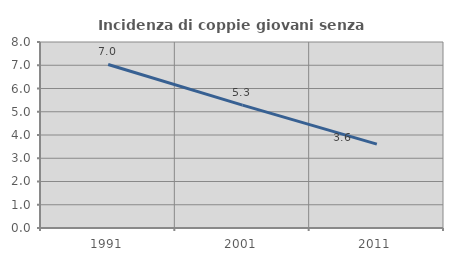
| Category | Incidenza di coppie giovani senza figli |
|---|---|
| 1991.0 | 7.034 |
| 2001.0 | 5.283 |
| 2011.0 | 3.608 |